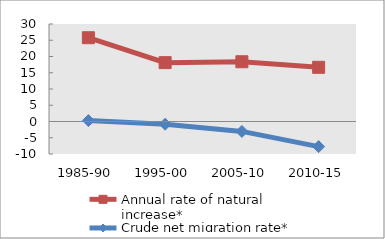
| Category | Annual rate of natural increase* | Crude net migration rate* |
|---|---|---|
| 1985-90 | 25.779 | 0.275 |
| 1995-00 | 18.108 | -0.833 |
| 2005-10 | 18.388 | -3.049 |
| 2010-15 | 16.675 | -7.726 |